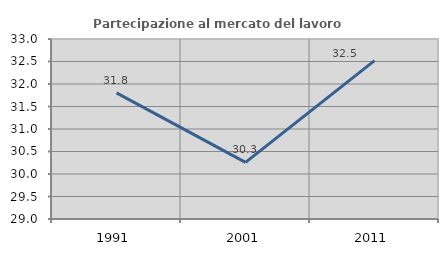
| Category | Partecipazione al mercato del lavoro  femminile |
|---|---|
| 1991.0 | 31.802 |
| 2001.0 | 30.258 |
| 2011.0 | 32.52 |